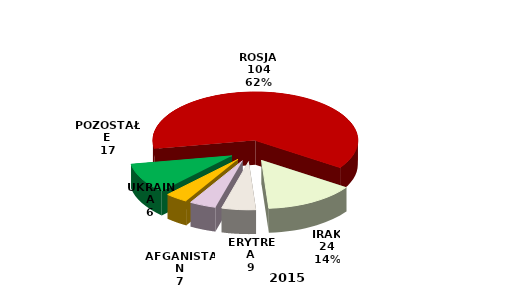
| Category | Series 0 |
|---|---|
| ROSJA | 104 |
| IRAK | 24 |
| ERYTREA | 9 |
| AFGANISTAN | 7 |
| UKRAINA | 6 |
| POZOSTAŁE | 17 |